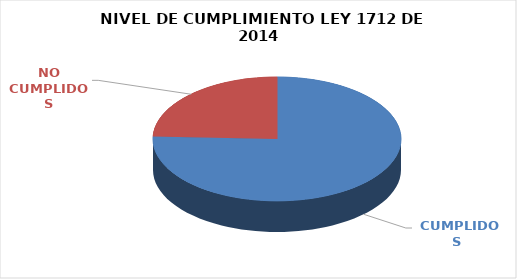
| Category | Series 0 |
|---|---|
|  CUMPLIDOS | 87 |
| NO CUMPLIDOS | 28 |